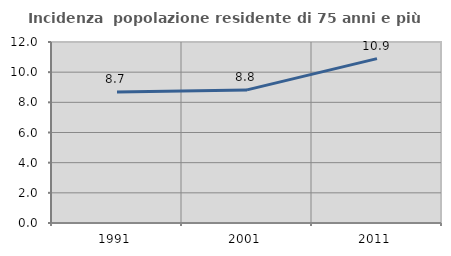
| Category | Incidenza  popolazione residente di 75 anni e più |
|---|---|
| 1991.0 | 8.687 |
| 2001.0 | 8.825 |
| 2011.0 | 10.896 |